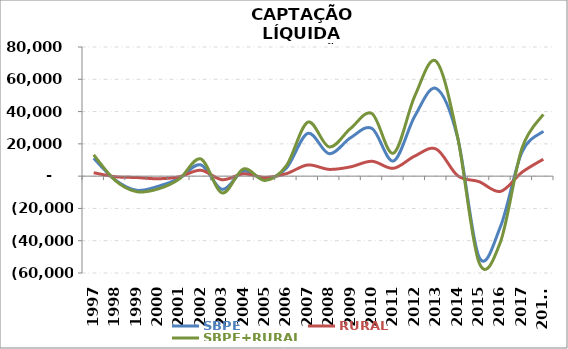
| Category | SBPE | RURAL | SBPE+RURAL |
|---|---|---|---|
| 1997 | 11079 | 2113.852 | 13192.852 |
| 1998 | -2301.5 | -361.228 | -2662.728 |
| 1999 | -8740.2 | -858.508 | -9598.708 |
| 2000 | -6355.964 | -1615.457 | -7971.421 |
| 2001 | -1319.381 | -412.963 | -1732.344 |
| 2002 | 7008.282 | 3649.972 | 10658.254 |
| 2003 | -8178.886 | -2213.868 | -10392.754 |
| 2004 | 3057.299 | 1425.147 | 4482.446 |
| 2005 | -1869.531 | -826.948 | -2696.479 |
| 2006 | 4963.736 | 1532.919 | 6496.655 |
| 2007 | 26493.6 | 6927.358 | 33420.958 |
| 2008 | 13900.71 | 4187.043 | 18087.753 |
| 2009 | 23813.033 | 5752.651 | 29565.684 |
| 2010 | 29513.472 | 9213.301 | 38726.773 |
| 2011 | 9382.932 | 4844.657 | 14227.589 |
| 2012 | 37239.575 | 12479.984 | 49719.559 |
| 2013 | 54280.749 | 16766.843 | 71047.592 |
| 2014 | 23758.558 | 275.423 | 24033.981 |
| 2015 | -50149.363 | -3418.504 | -53567.867 |
| 2016 | -31222.546 | -9479.207 | -40701.753 |
| 2017 | 14774.799 | 2351.903 | 17126.702 |
| 2018* | 27791.076 | 10469.293 | 38260.369 |